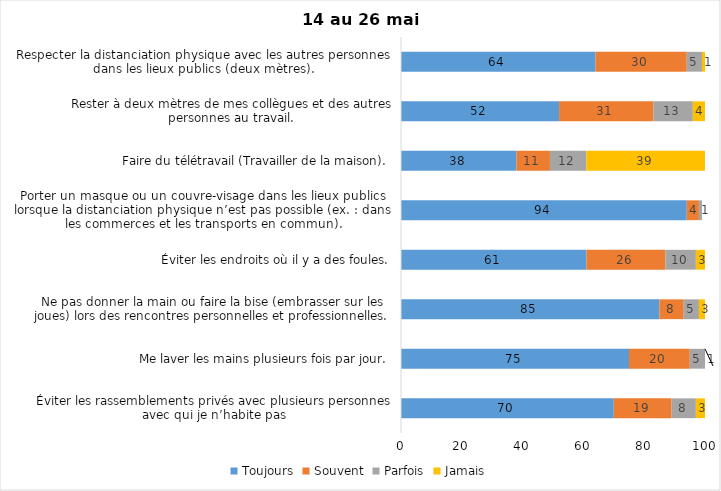
| Category | Toujours | Souvent | Parfois | Jamais |
|---|---|---|---|---|
| Éviter les rassemblements privés avec plusieurs personnes avec qui je n’habite pas | 70 | 19 | 8 | 3 |
| Me laver les mains plusieurs fois par jour. | 75 | 20 | 5 | 1 |
| Ne pas donner la main ou faire la bise (embrasser sur les joues) lors des rencontres personnelles et professionnelles. | 85 | 8 | 5 | 3 |
| Éviter les endroits où il y a des foules. | 61 | 26 | 10 | 3 |
| Porter un masque ou un couvre-visage dans les lieux publics lorsque la distanciation physique n’est pas possible (ex. : dans les commerces et les transports en commun). | 94 | 4 | 1 | 0 |
| Faire du télétravail (Travailler de la maison). | 38 | 11 | 12 | 39 |
| Rester à deux mètres de mes collègues et des autres personnes au travail. | 52 | 31 | 13 | 4 |
| Respecter la distanciation physique avec les autres personnes dans les lieux publics (deux mètres). | 64 | 30 | 5 | 1 |